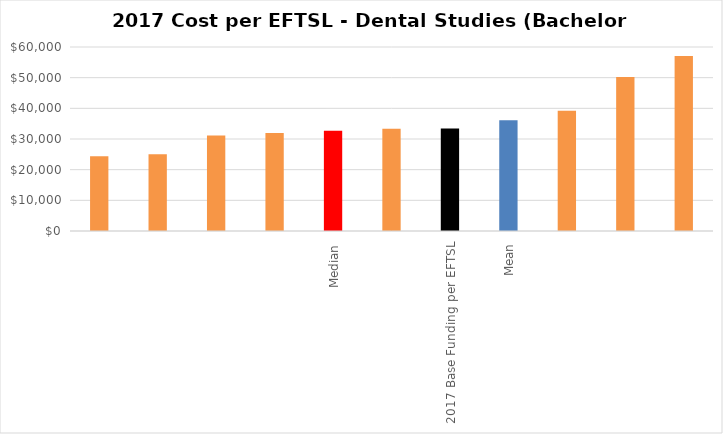
| Category | Series 0 |
|---|---|
|  | 24349.951 |
|  | 25042.444 |
|  | 31109.856 |
|  | 31964.627 |
| Median | 32669.462 |
|  | 33374.298 |
| 2017 Base Funding per EFTSL | 33405 |
| Mean | 36116 |